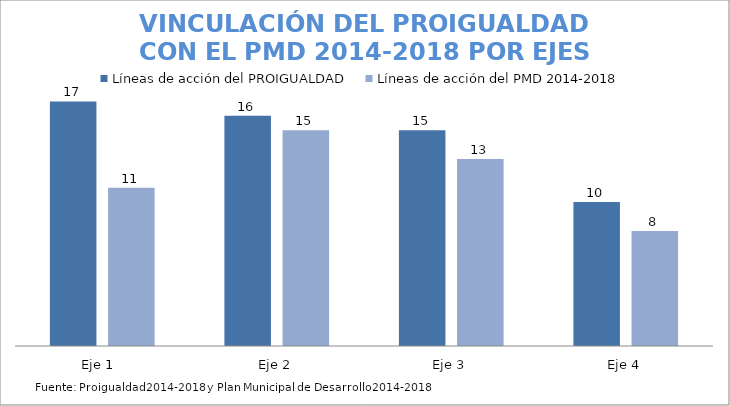
| Category | Líneas de acción del PROIGUALDAD | Líneas de acción del PMD 2014-2018 |
|---|---|---|
| Eje 1  | 17 | 11 |
| Eje 2 | 16 | 15 |
| Eje 3 | 15 | 13 |
| Eje 4 | 10 | 8 |